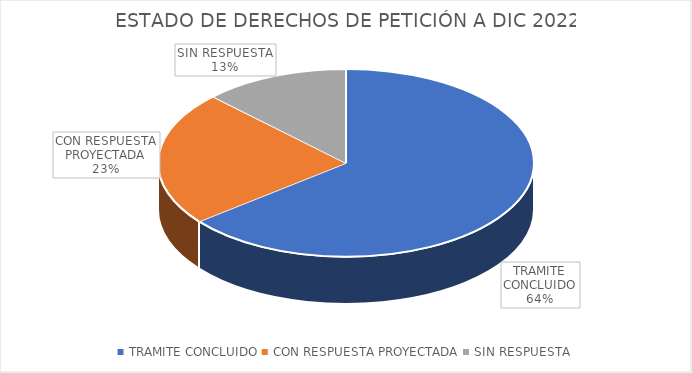
| Category | CANTIDAD |
|---|---|
| TRAMITE CONCLUIDO | 36 |
| CON RESPUESTA PROYECTADA | 13 |
| SIN RESPUESTA | 7 |